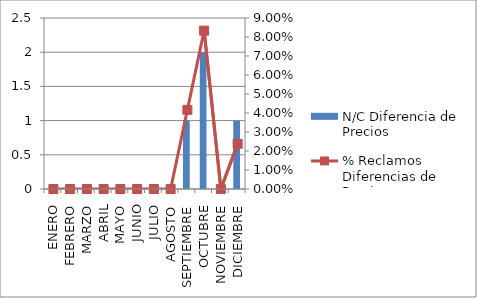
| Category | N/C Diferencia de Precios |
|---|---|
| ENERO | 0 |
| FEBRERO | 0 |
| MARZO | 0 |
| ABRIL | 0 |
| MAYO | 0 |
| JUNIO | 0 |
| JULIO | 0 |
| AGOSTO | 0 |
| SEPTIEMBRE | 1 |
| OCTUBRE | 2 |
| NOVIEMBRE | 0 |
| DICIEMBRE | 1 |